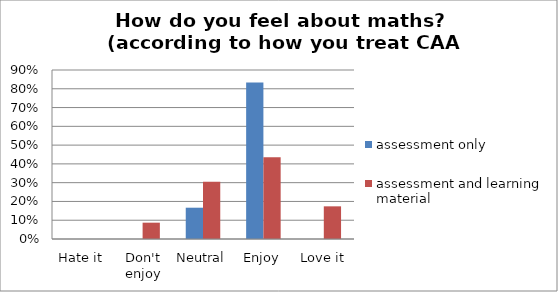
| Category | assessment only | assessment and learning material |
|---|---|---|
| Hate it | 0 | 0 |
| Don't enjoy | 0 | 0.087 |
| Neutral | 0.167 | 0.304 |
| Enjoy | 0.833 | 0.435 |
| Love it | 0 | 0.174 |